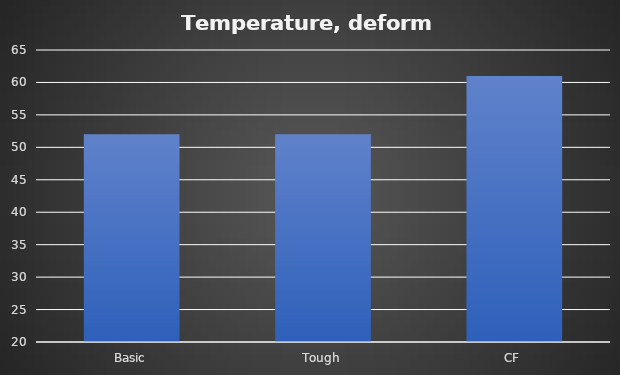
| Category | Deform °C |
|---|---|
| Basic | 52 |
| Tough | 52 |
| CF | 61 |